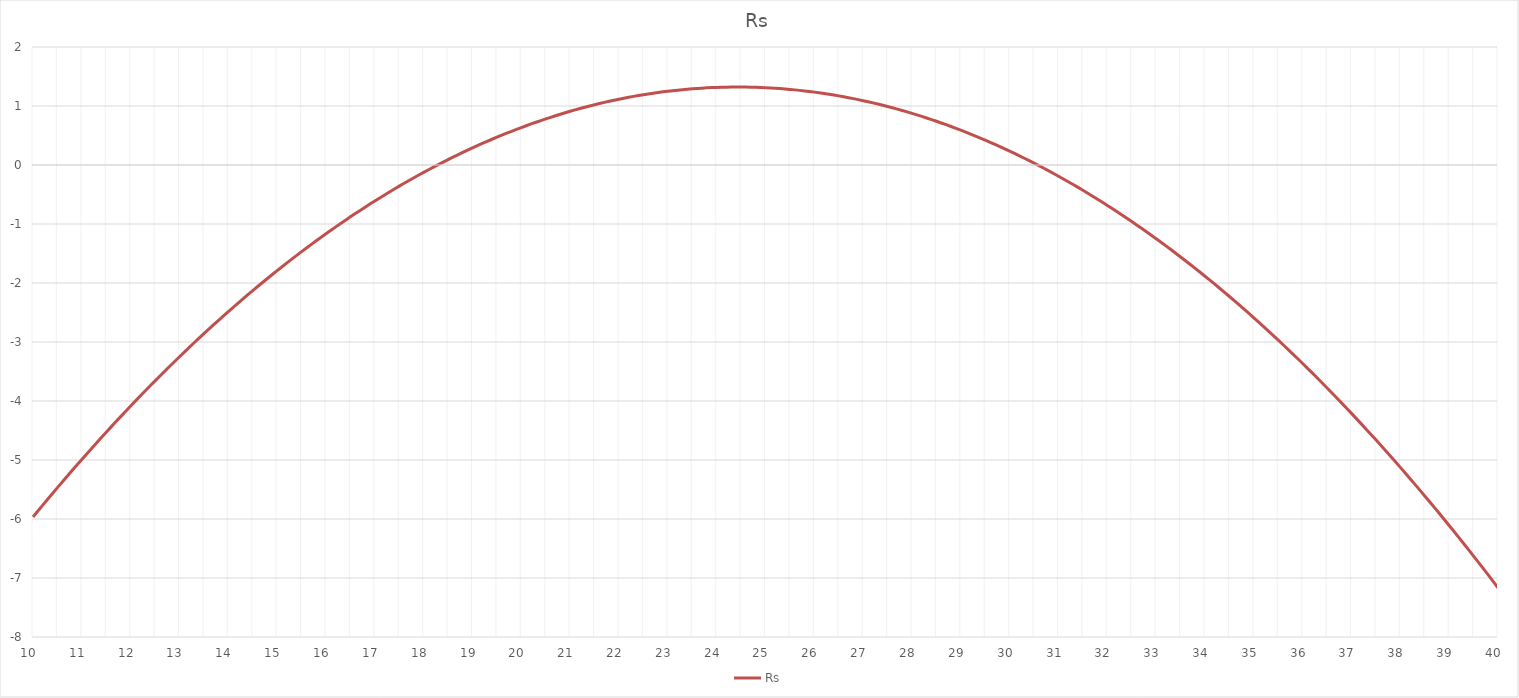
| Category | Rs |
|---|---|
| 10.0 | -5.965 |
| 10.1 | -5.864 |
| 10.2 | -5.764 |
| 10.3 | -5.665 |
| 10.4 | -5.567 |
| 10.5 | -5.469 |
| 10.6 | -5.372 |
| 10.7 | -5.275 |
| 10.8 | -5.179 |
| 10.9 | -5.084 |
| 11.0 | -4.99 |
| 11.1 | -4.896 |
| 11.2 | -4.803 |
| 11.3 | -4.711 |
| 11.4 | -4.62 |
| 11.5 | -4.529 |
| 11.6 | -4.439 |
| 11.7 | -4.349 |
| 11.8 | -4.26 |
| 11.9 | -4.172 |
| 12.0 | -4.085 |
| 12.1 | -3.998 |
| 12.2 | -3.912 |
| 12.3 | -3.827 |
| 12.4 | -3.743 |
| 12.5 | -3.659 |
| 12.6 | -3.576 |
| 12.7 | -3.493 |
| 12.8 | -3.411 |
| 12.9 | -3.33 |
| 13.0 | -3.25 |
| 13.1 | -3.17 |
| 13.2 | -3.091 |
| 13.3 | -3.013 |
| 13.4 | -2.936 |
| 13.5 | -2.859 |
| 13.6 | -2.783 |
| 13.7 | -2.707 |
| 13.8 | -2.632 |
| 13.9 | -2.558 |
| 14.0 | -2.485 |
| 14.1 | -2.412 |
| 14.2 | -2.34 |
| 14.3 | -2.269 |
| 14.4 | -2.199 |
| 14.5 | -2.129 |
| 14.6 | -2.06 |
| 14.7 | -1.991 |
| 14.8 | -1.923 |
| 14.9 | -1.856 |
| 15.0 | -1.79 |
| 15.1 | -1.724 |
| 15.2 | -1.659 |
| 15.3 | -1.595 |
| 15.4 | -1.532 |
| 15.5 | -1.469 |
| 15.6 | -1.407 |
| 15.7 | -1.345 |
| 15.8 | -1.284 |
| 15.9 | -1.224 |
| 16.0 | -1.165 |
| 16.1 | -1.106 |
| 16.2 | -1.048 |
| 16.3 | -0.991 |
| 16.4 | -0.935 |
| 16.5 | -0.879 |
| 16.6 | -0.824 |
| 16.7 | -0.769 |
| 16.8 | -0.715 |
| 16.9 | -0.662 |
| 17.0 | -0.61 |
| 17.1 | -0.558 |
| 17.2 | -0.507 |
| 17.3 | -0.457 |
| 17.4 | -0.408 |
| 17.5 | -0.359 |
| 17.6 | -0.311 |
| 17.7 | -0.263 |
| 17.8 | -0.216 |
| 17.9 | -0.17 |
| 18.0 | -0.125 |
| 18.1 | -0.08 |
| 18.2 | -0.036 |
| 18.3 | 0.007 |
| 18.4 | 0.049 |
| 18.5 | 0.091 |
| 18.6 | 0.132 |
| 18.7 | 0.173 |
| 18.8 | 0.213 |
| 18.9 | 0.252 |
| 19.0 | 0.29 |
| 19.1 | 0.328 |
| 19.2 | 0.365 |
| 19.3 | 0.401 |
| 19.4 | 0.436 |
| 19.5 | 0.471 |
| 19.6 | 0.505 |
| 19.7 | 0.539 |
| 19.8 | 0.572 |
| 19.9 | 0.604 |
| 20.0 | 0.635 |
| 20.1 | 0.666 |
| 20.2 | 0.696 |
| 20.3 | 0.725 |
| 20.4 | 0.753 |
| 20.5 | 0.781 |
| 20.6 | 0.808 |
| 20.7 | 0.835 |
| 20.8 | 0.861 |
| 20.9 | 0.886 |
| 21.0 | 0.91 |
| 21.1 | 0.934 |
| 21.2 | 0.957 |
| 21.3 | 0.979 |
| 21.4 | 1 |
| 21.5 | 1.021 |
| 21.6 | 1.041 |
| 21.7 | 1.061 |
| 21.8 | 1.08 |
| 21.9 | 1.098 |
| 22.0 | 1.115 |
| 22.1 | 1.132 |
| 22.2 | 1.148 |
| 22.3 | 1.163 |
| 22.4 | 1.177 |
| 22.5 | 1.191 |
| 22.6 | 1.204 |
| 22.7 | 1.217 |
| 22.8 | 1.229 |
| 22.9 | 1.24 |
| 23.0 | 1.25 |
| 23.1 | 1.26 |
| 23.2 | 1.269 |
| 23.3 | 1.277 |
| 23.4 | 1.284 |
| 23.5 | 1.291 |
| 23.6 | 1.297 |
| 23.7 | 1.303 |
| 23.8 | 1.308 |
| 23.9 | 1.312 |
| 24.0 | 1.315 |
| 24.0999999999999 | 1.318 |
| 24.1999999999999 | 1.32 |
| 24.2999999999999 | 1.321 |
| 24.3999999999999 | 1.321 |
| 24.4999999999999 | 1.321 |
| 24.5999999999999 | 1.32 |
| 24.6999999999999 | 1.319 |
| 24.7999999999999 | 1.317 |
| 24.8999999999999 | 1.314 |
| 24.9999999999999 | 1.31 |
| 25.0999999999999 | 1.306 |
| 25.1999999999999 | 1.301 |
| 25.2999999999999 | 1.295 |
| 25.3999999999999 | 1.288 |
| 25.4999999999999 | 1.281 |
| 25.5999999999999 | 1.273 |
| 25.6999999999999 | 1.265 |
| 25.7999999999999 | 1.256 |
| 25.8999999999999 | 1.246 |
| 25.9999999999999 | 1.235 |
| 26.0999999999999 | 1.224 |
| 26.1999999999999 | 1.212 |
| 26.2999999999999 | 1.199 |
| 26.3999999999999 | 1.185 |
| 26.4999999999999 | 1.171 |
| 26.5999999999999 | 1.156 |
| 26.6999999999999 | 1.141 |
| 26.7999999999999 | 1.125 |
| 26.8999999999999 | 1.108 |
| 26.9999999999999 | 1.09 |
| 27.0999999999999 | 1.072 |
| 27.1999999999999 | 1.053 |
| 27.2999999999999 | 1.033 |
| 27.3999999999999 | 1.012 |
| 27.4999999999999 | 0.991 |
| 27.5999999999999 | 0.969 |
| 27.6999999999999 | 0.947 |
| 27.7999999999999 | 0.924 |
| 27.8999999999999 | 0.9 |
| 27.9999999999999 | 0.875 |
| 28.0999999999999 | 0.85 |
| 28.1999999999999 | 0.824 |
| 28.2999999999999 | 0.797 |
| 28.3999999999999 | 0.769 |
| 28.4999999999999 | 0.741 |
| 28.5999999999999 | 0.712 |
| 28.6999999999999 | 0.683 |
| 28.7999999999999 | 0.653 |
| 28.8999999999999 | 0.622 |
| 28.9999999999999 | 0.59 |
| 29.0999999999999 | 0.558 |
| 29.1999999999999 | 0.525 |
| 29.2999999999999 | 0.491 |
| 29.3999999999999 | 0.456 |
| 29.4999999999999 | 0.421 |
| 29.5999999999999 | 0.385 |
| 29.6999999999999 | 0.349 |
| 29.7999999999999 | 0.312 |
| 29.8999999999999 | 0.274 |
| 29.9999999999999 | 0.235 |
| 30.0999999999999 | 0.196 |
| 30.1999999999999 | 0.156 |
| 30.2999999999999 | 0.115 |
| 30.3999999999999 | 0.073 |
| 30.4999999999999 | 0.031 |
| 30.5999999999999 | -0.012 |
| 30.6999999999999 | -0.055 |
| 30.7999999999999 | -0.099 |
| 30.8999999999999 | -0.144 |
| 30.9999999999999 | -0.19 |
| 31.0999999999999 | -0.236 |
| 31.1999999999999 | -0.283 |
| 31.2999999999999 | -0.331 |
| 31.3999999999999 | -0.38 |
| 31.4999999999999 | -0.429 |
| 31.5999999999999 | -0.479 |
| 31.6999999999999 | -0.529 |
| 31.7999999999999 | -0.58 |
| 31.8999999999999 | -0.632 |
| 31.9999999999999 | -0.685 |
| 32.0999999999999 | -0.738 |
| 32.1999999999999 | -0.792 |
| 32.2999999999999 | -0.847 |
| 32.3999999999999 | -0.903 |
| 32.4999999999999 | -0.959 |
| 32.5999999999999 | -1.016 |
| 32.6999999999999 | -1.073 |
| 32.7999999999999 | -1.131 |
| 32.8999999999999 | -1.19 |
| 32.9999999999999 | -1.25 |
| 33.0999999999999 | -1.31 |
| 33.1999999999999 | -1.371 |
| 33.2999999999999 | -1.433 |
| 33.3999999999999 | -1.496 |
| 33.4999999999999 | -1.559 |
| 33.5999999999999 | -1.623 |
| 33.6999999999999 | -1.687 |
| 33.7999999999999 | -1.752 |
| 33.8999999999999 | -1.818 |
| 33.9999999999999 | -1.885 |
| 34.0999999999999 | -1.952 |
| 34.1999999999999 | -2.02 |
| 34.2999999999999 | -2.089 |
| 34.3999999999999 | -2.159 |
| 34.4999999999999 | -2.229 |
| 34.5999999999999 | -2.3 |
| 34.6999999999999 | -2.371 |
| 34.7999999999999 | -2.443 |
| 34.8999999999999 | -2.516 |
| 34.9999999999999 | -2.59 |
| 35.0999999999999 | -2.664 |
| 35.1999999999999 | -2.739 |
| 35.2999999999999 | -2.815 |
| 35.3999999999999 | -2.892 |
| 35.4999999999999 | -2.969 |
| 35.5999999999999 | -3.047 |
| 35.6999999999999 | -3.125 |
| 35.7999999999999 | -3.204 |
| 35.8999999999999 | -3.284 |
| 35.9999999999999 | -3.365 |
| 36.0999999999999 | -3.446 |
| 36.1999999999999 | -3.528 |
| 36.2999999999999 | -3.611 |
| 36.3999999999999 | -3.695 |
| 36.4999999999999 | -3.779 |
| 36.5999999999999 | -3.864 |
| 36.6999999999999 | -3.949 |
| 36.7999999999999 | -4.035 |
| 36.8999999999999 | -4.122 |
| 36.9999999999999 | -4.21 |
| 37.0999999999999 | -4.298 |
| 37.1999999999999 | -4.387 |
| 37.2999999999999 | -4.477 |
| 37.3999999999999 | -4.568 |
| 37.4999999999999 | -4.659 |
| 37.5999999999999 | -4.751 |
| 37.6999999999999 | -4.843 |
| 37.7999999999999 | -4.936 |
| 37.8999999999999 | -5.03 |
| 37.9999999999999 | -5.125 |
| 38.0999999999999 | -5.22 |
| 38.1999999999999 | -5.316 |
| 38.2999999999999 | -5.413 |
| 38.3999999999999 | -5.511 |
| 38.4999999999999 | -5.609 |
| 38.5999999999999 | -5.708 |
| 38.6999999999999 | -5.807 |
| 38.7999999999999 | -5.907 |
| 38.8999999999999 | -6.008 |
| 38.9999999999999 | -6.11 |
| 39.0999999999999 | -6.212 |
| 39.1999999999999 | -6.315 |
| 39.2999999999999 | -6.419 |
| 39.3999999999999 | -6.524 |
| 39.4999999999999 | -6.629 |
| 39.5999999999999 | -6.735 |
| 39.6999999999999 | -6.841 |
| 39.7999999999999 | -6.948 |
| 39.8999999999999 | -7.056 |
| 39.9999999999999 | -7.165 |